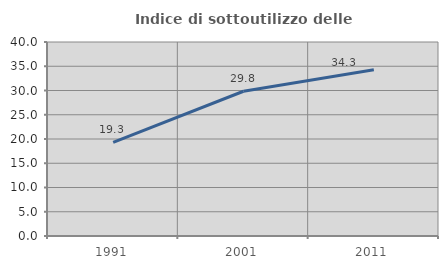
| Category | Indice di sottoutilizzo delle abitazioni  |
|---|---|
| 1991.0 | 19.313 |
| 2001.0 | 29.843 |
| 2011.0 | 34.264 |